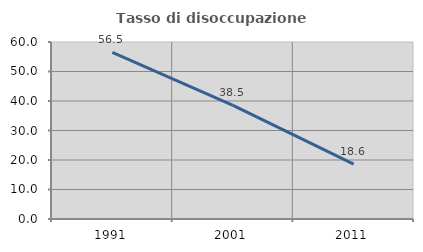
| Category | Tasso di disoccupazione giovanile  |
|---|---|
| 1991.0 | 56.497 |
| 2001.0 | 38.525 |
| 2011.0 | 18.584 |